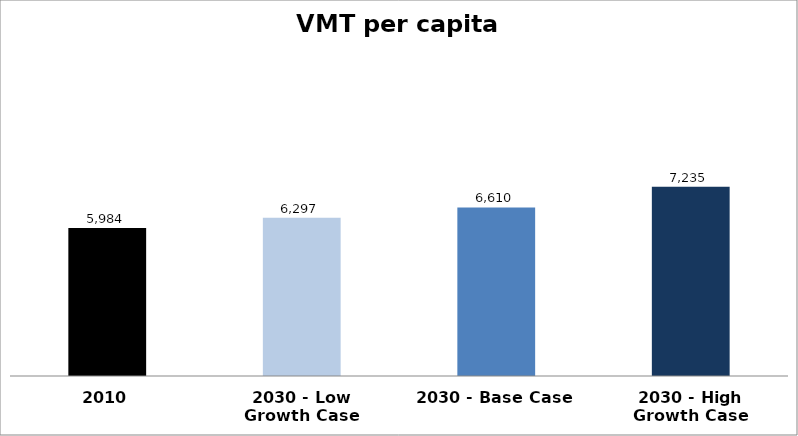
| Category | VMT per capita (annual) |
|---|---|
| 2010 | 5984.444 |
| 2030 - Low Growth Case | 6297.131 |
| 2030 - Base Case | 6609.819 |
| 2030 - High Growth Case | 7235.193 |